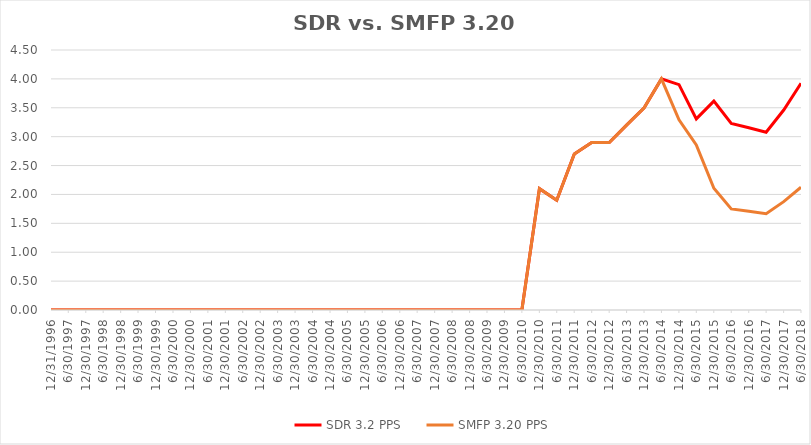
| Category | SDR 3.2 PPS | SMFP 3.20 PPS |
|---|---|---|
| 12/31/96 | 0 | 0 |
| 6/30/97 | 0 | 0 |
| 12/31/97 | 0 | 0 |
| 6/30/98 | 0 | 0 |
| 12/31/98 | 0 | 0 |
| 6/30/99 | 0 | 0 |
| 12/31/99 | 0 | 0 |
| 6/30/00 | 0 | 0 |
| 12/31/00 | 0 | 0 |
| 6/30/01 | 0 | 0 |
| 12/31/01 | 0 | 0 |
| 6/30/02 | 0 | 0 |
| 12/31/02 | 0 | 0 |
| 6/30/03 | 0 | 0 |
| 12/31/03 | 0 | 0 |
| 6/30/04 | 0 | 0 |
| 12/31/04 | 0 | 0 |
| 6/30/05 | 0 | 0 |
| 12/31/05 | 0 | 0 |
| 6/30/06 | 0 | 0 |
| 12/31/06 | 0 | 0 |
| 6/30/07 | 0 | 0 |
| 12/31/07 | 0 | 0 |
| 6/30/08 | 0 | 0 |
| 12/31/08 | 0 | 0 |
| 6/30/09 | 0 | 0 |
| 12/31/09 | 0 | 0 |
| 6/30/10 | 0 | 0 |
| 12/31/10 | 2.1 | 2.1 |
| 6/30/11 | 1.9 | 1.9 |
| 12/31/11 | 2.7 | 2.7 |
| 6/30/12 | 2.9 | 2.9 |
| 12/31/12 | 2.9 | 2.9 |
| 6/30/13 | 3.2 | 3.2 |
| 12/31/13 | 3.5 | 3.5 |
| 6/30/14 | 4 | 4 |
| 12/31/14 | 3.9 | 3.291 |
| 6/30/15 | 3.308 | 2.857 |
| 12/31/15 | 3.615 | 2.108 |
| 6/30/16 | 3.231 | 1.75 |
| 12/31/16 | 3.154 | 1.708 |
| 6/30/17 | 3.077 | 1.667 |
| 12/31/17 | 3.462 | 1.875 |
| 6/30/18 | 3.923 | 2.125 |